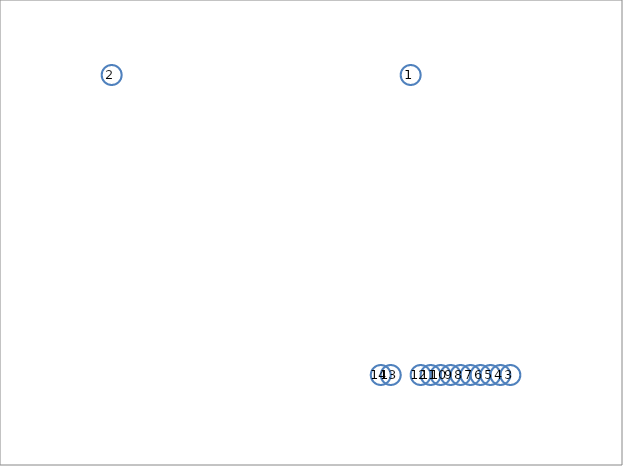
| Category | Series 0 |
|---|---|
| 4.0 | 5 |
| 1.0 | 5 |
| 5.0 | 1 |
| 4.9 | 1 |
| 4.8 | 1 |
| 4.7 | 1 |
| 4.6 | 1 |
| 4.5 | 1 |
| 4.4 | 1 |
| 4.3 | 1 |
| 4.2 | 1 |
| 4.1 | 1 |
| 3.8 | 1 |
| 3.7 | 1 |